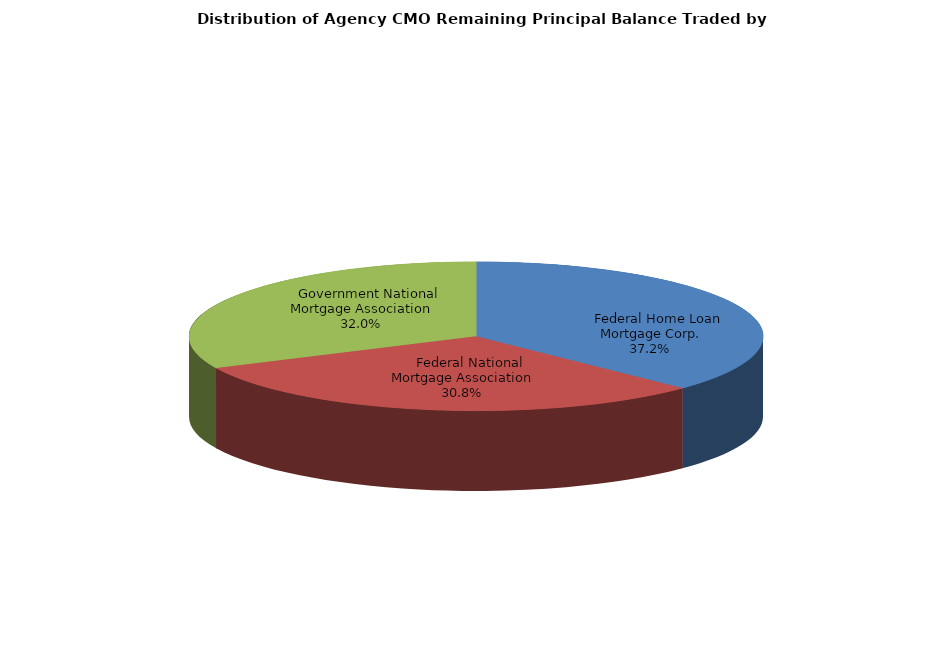
| Category | Series 0 |
|---|---|
|     Federal Home Loan Mortgage Corp. | 1254740855.964 |
|     Federal National Mortgage Association | 1037275245.136 |
|     Government National Mortgage Association | 1078297808.163 |